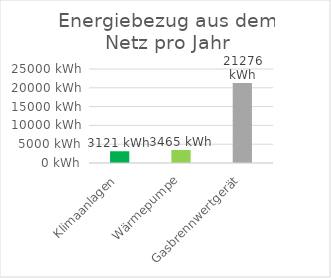
| Category | Series 0 |
|---|---|
| Klimaanlagen | 3120.966 |
| Wärmepumpe | 3465 |
| Gasbrennwertgerät | 21276.316 |